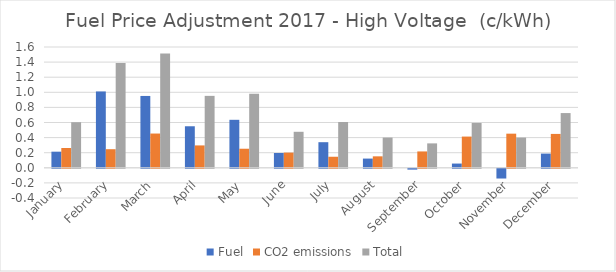
| Category | Fuel | CO2 emissions | Total |
|---|---|---|---|
| January | 0.214 | 0.262 | 0.604 |
| February | 1.011 | 0.246 | 1.387 |
| March | 0.952 | 0.454 | 1.514 |
| April | 0.55 | 0.296 | 0.953 |
| May | 0.636 | 0.252 | 0.981 |
| June | 0.196 | 0.201 | 0.477 |
| July | 0.339 | 0.146 | 0.606 |
| August | 0.122 | 0.152 | 0.4 |
| September | -0.011 | 0.217 | 0.323 |
| October | 0.056 | 0.414 | 0.594 |
| November | -0.129 | 0.452 | 0.4 |
| December | 0.188 | 0.449 | 0.725 |